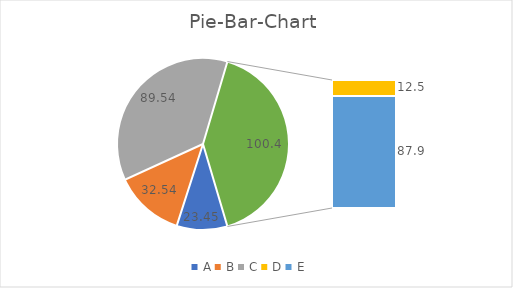
| Category | Pie-Bar-Chart |
|---|---|
| A | 23.45 |
| B | 32.54 |
| C | 89.54 |
| D | 12.5 |
| E | 87.9 |